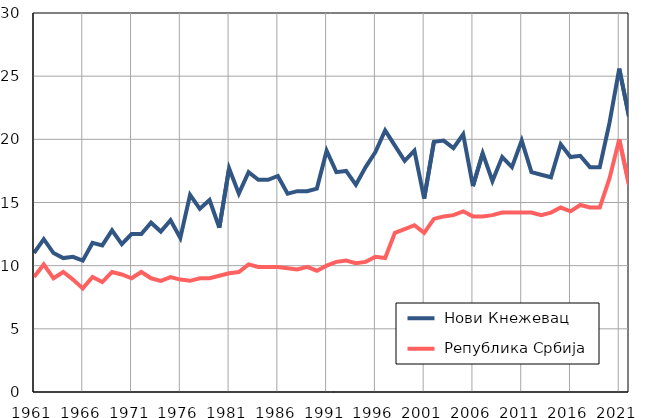
| Category |  Нови Кнежевац |  Република Србија |
|---|---|---|
| 1961.0 | 11 | 9.1 |
| 1962.0 | 12.1 | 10.1 |
| 1963.0 | 11 | 9 |
| 1964.0 | 10.6 | 9.5 |
| 1965.0 | 10.7 | 8.9 |
| 1966.0 | 10.4 | 8.2 |
| 1967.0 | 11.8 | 9.1 |
| 1968.0 | 11.6 | 8.7 |
| 1969.0 | 12.8 | 9.5 |
| 1970.0 | 11.7 | 9.3 |
| 1971.0 | 12.5 | 9 |
| 1972.0 | 12.5 | 9.5 |
| 1973.0 | 13.4 | 9 |
| 1974.0 | 12.7 | 8.8 |
| 1975.0 | 13.6 | 9.1 |
| 1976.0 | 12.2 | 8.9 |
| 1977.0 | 15.6 | 8.8 |
| 1978.0 | 14.5 | 9 |
| 1979.0 | 15.2 | 9 |
| 1980.0 | 13 | 9.2 |
| 1981.0 | 17.7 | 9.4 |
| 1982.0 | 15.7 | 9.5 |
| 1983.0 | 17.4 | 10.1 |
| 1984.0 | 16.8 | 9.9 |
| 1985.0 | 16.8 | 9.9 |
| 1986.0 | 17.1 | 9.9 |
| 1987.0 | 15.7 | 9.8 |
| 1988.0 | 15.9 | 9.7 |
| 1989.0 | 15.9 | 9.9 |
| 1990.0 | 16.1 | 9.6 |
| 1991.0 | 19.1 | 10 |
| 1992.0 | 17.4 | 10.3 |
| 1993.0 | 17.5 | 10.4 |
| 1994.0 | 16.4 | 10.2 |
| 1995.0 | 17.8 | 10.3 |
| 1996.0 | 19 | 10.7 |
| 1997.0 | 20.7 | 10.6 |
| 1998.0 | 19.5 | 12.6 |
| 1999.0 | 18.3 | 12.9 |
| 2000.0 | 19.1 | 13.2 |
| 2001.0 | 15.3 | 12.6 |
| 2002.0 | 19.8 | 13.7 |
| 2003.0 | 19.9 | 13.9 |
| 2004.0 | 19.3 | 14 |
| 2005.0 | 20.4 | 14.3 |
| 2006.0 | 16.3 | 13.9 |
| 2007.0 | 18.9 | 13.9 |
| 2008.0 | 16.7 | 14 |
| 2009.0 | 18.6 | 14.2 |
| 2010.0 | 17.8 | 14.2 |
| 2011.0 | 19.9 | 14.2 |
| 2012.0 | 17.4 | 14.2 |
| 2013.0 | 17.2 | 14 |
| 2014.0 | 17 | 14.2 |
| 2015.0 | 19.6 | 14.6 |
| 2016.0 | 18.6 | 14.3 |
| 2017.0 | 18.7 | 14.8 |
| 2018.0 | 17.8 | 14.6 |
| 2019.0 | 17.8 | 14.6 |
| 2020.0 | 21.3 | 16.9 |
| 2021.0 | 25.6 | 20 |
| 2022.0 | 21.8 | 16.4 |